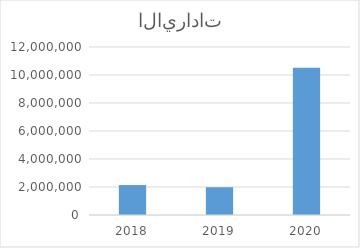
| Category | الإلتزام بالموازنة من حيث الايرادات |
|---|---|
| 2018.0 | 2139016.339 |
| 2019.0 | 1983425 |
| 2020.0 | 10514057 |